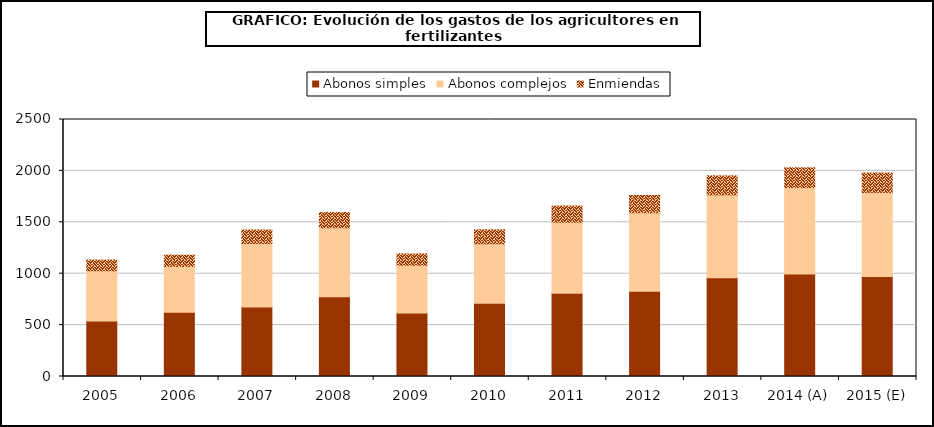
| Category | Abonos simples | Abonos complejos | Enmiendas |
|---|---|---|---|
| 2005 | 540.324 | 487.841 | 104.7 |
| 2006 | 623.947 | 446.76 | 109.46 |
| 2007 | 675.341 | 618.526 | 131.725 |
| 2008 | 776.533 | 671.033 | 147.519 |
| 2009 | 617.926 | 464.475 | 110.568 |
| 2010 | 711.864 | 580.242 | 135.989 |
| 2011 | 809.32 | 692.087 | 157.487 |
| 2012 | 828.171 | 764.88 | 167.637 |
| 2013 | 959.679 | 806.665 | 185.766 |
| 2014 (A) | 998.154 | 839.005 | 193.214 |
| 2015 (E) | 972.983 | 817.848 | 188.342 |